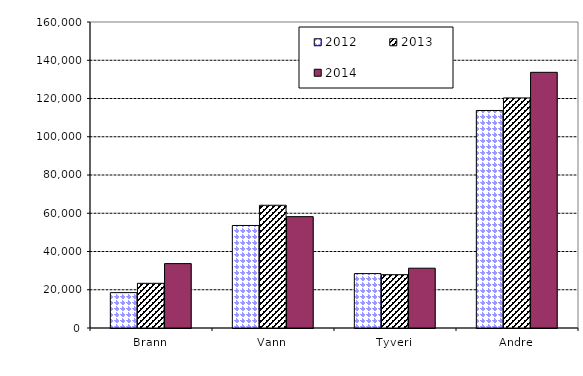
| Category | 2012 | 2013 | 2014 |
|---|---|---|---|
| Brann | 18489.054 | 23361.844 | 33667 |
| Vann | 53604.461 | 64182.944 | 58221 |
| Tyveri | 28444.781 | 27877.956 | 31267 |
| Andre | 113738.518 | 120296.66 | 133689 |